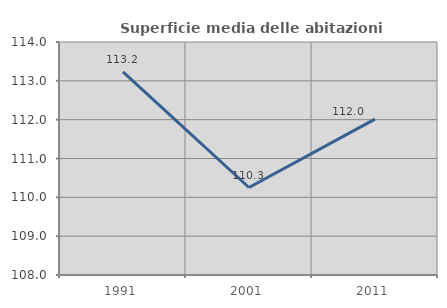
| Category | Superficie media delle abitazioni occupate |
|---|---|
| 1991.0 | 113.233 |
| 2001.0 | 110.253 |
| 2011.0 | 112.012 |